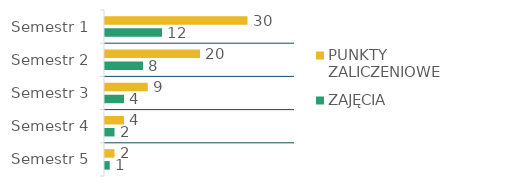
| Category | PUNKTY ZALICZENIOWE | ZAJĘCIA |
|---|---|---|
| Semestr 1 | 30 | 12 |
| Semestr 2 | 20 | 8 |
| Semestr 3 | 9 | 4 |
| Semestr 4 | 4 | 2 |
| Semestr 5 | 2 | 1 |